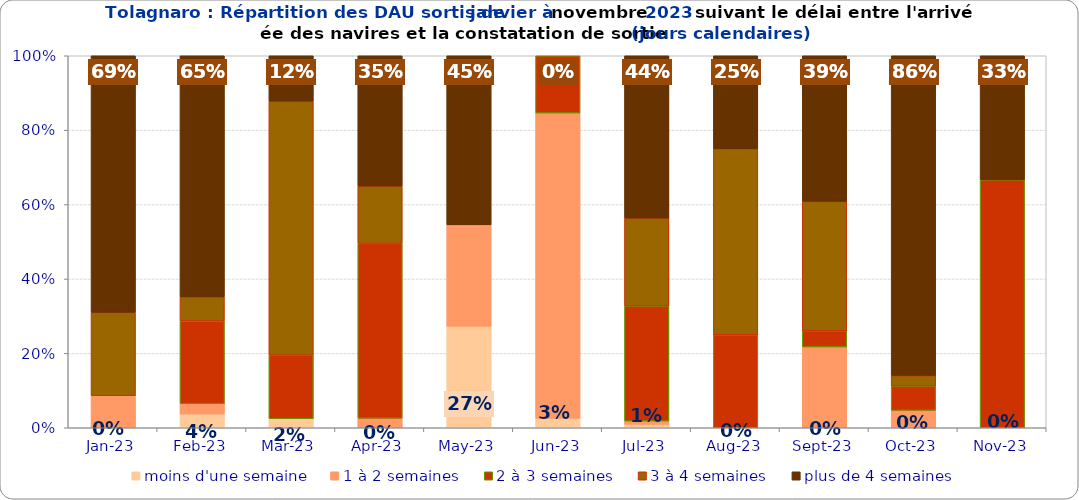
| Category | moins d'une semaine | 1 à 2 semaines | 2 à 3 semaines | 3 à 4 semaines | plus de 4 semaines |
|---|---|---|---|---|---|
| 2023-01-01 | 0 | 0.086 | 0 | 0.224 | 0.69 |
| 2023-02-01 | 0.037 | 0.028 | 0.222 | 0.065 | 0.648 |
| 2023-03-01 | 0.024 | 0 | 0.171 | 0.683 | 0.122 |
| 2023-04-01 | 0 | 0.026 | 0.47 | 0.154 | 0.35 |
| 2023-05-01 | 0.273 | 0.273 | 0 | 0 | 0.455 |
| 2023-06-01 | 0.026 | 0.821 | 0.154 | 0 | 0 |
| 2023-07-01 | 0.009 | 0.009 | 0.309 | 0.236 | 0.436 |
| 2023-08-01 | 0 | 0 | 0.25 | 0.5 | 0.25 |
| 2023-09-01 | 0 | 0.217 | 0.043 | 0.348 | 0.391 |
| 2023-10-01 | 0 | 0.047 | 0.065 | 0.028 | 0.86 |
| 2023-11-01 | 0 | 0 | 0.667 | 0 | 0.333 |